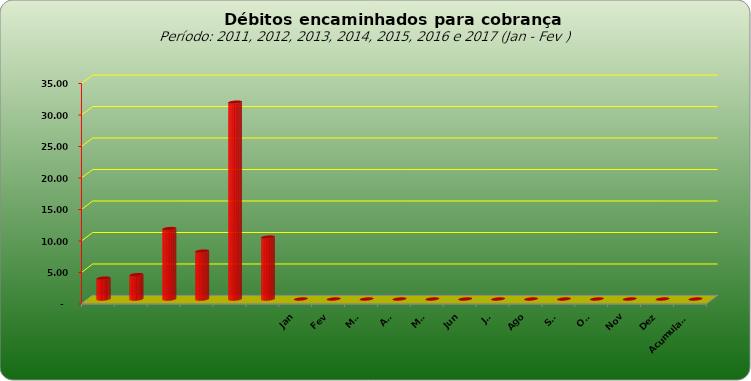
| Category |  3.309.443,02  |
|---|---|
|  | 3309443.02 |
|  | 3859728.44 |
|  | 11181928.25 |
|  | 7600526.01 |
|  | 31248623.5 |
|  | 9830198.34 |
| Jan | 0 |
| Fev | 0 |
| Mar | 0 |
| Abr | 0 |
| Mai | 0 |
| Jun | 0 |
| Jul | 0 |
| Ago | 0 |
| Set | 0 |
| Out | 0 |
| Nov | 0 |
| Dez | 0 |
| Acumulado | 0 |